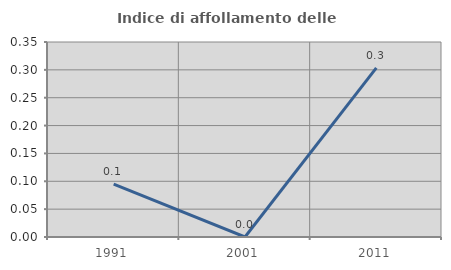
| Category | Indice di affollamento delle abitazioni  |
|---|---|
| 1991.0 | 0.095 |
| 2001.0 | 0 |
| 2011.0 | 0.303 |